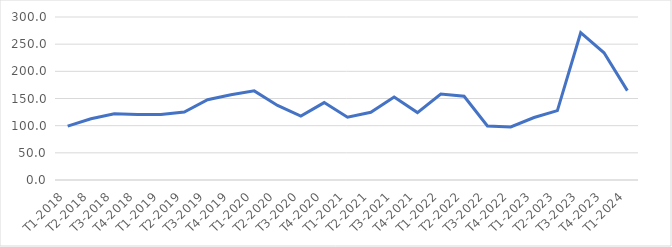
| Category | Series 0 |
|---|---|
| T1-2018 | 99.234 |
| T2-2018 | 112.61 |
| T3-2018 | 122.03 |
| T4-2018 | 120.37 |
| T1-2019 | 120.756 |
| T2-2019 | 125.005 |
| T3-2019 | 147.845 |
| T4-2019 | 156.824 |
| T1-2020 | 164.044 |
| T2-2020 | 137.137 |
| T3-2020 | 117.639 |
| T4-2020 | 142.494 |
| T1-2021 | 115.458 |
| T2-2021 | 124.74 |
| T3-2021 | 152.569 |
| T4-2021 | 124.074 |
| T1-2022 | 158.196 |
| T2-2022 | 154.171 |
| T3-2022 | 99.315 |
| T4-2022 | 97.723 |
| T1-2023 | 115.019 |
| T2-2023 | 127.674 |
| T3-2023 | 271.052 |
| T4-2023 | 234.175 |
| T1-2024 | 164.496 |